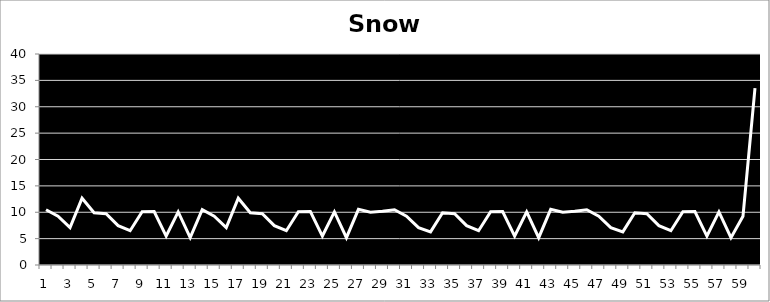
| Category | Snow |
|---|---|
| 0 | 10.479 |
| 1 | 9.241 |
| 2 | 7.08 |
| 3 | 12.66 |
| 4 | 9.905 |
| 5 | 9.719 |
| 6 | 7.466 |
| 7 | 6.505 |
| 8 | 10.093 |
| 9 | 10.122 |
| 10 | 5.49 |
| 11 | 10.057 |
| 12 | 5.175 |
| 13 | 10.479 |
| 14 | 9.241 |
| 15 | 7.08 |
| 16 | 12.66 |
| 17 | 9.905 |
| 18 | 9.719 |
| 19 | 7.466 |
| 20 | 6.505 |
| 21 | 10.093 |
| 22 | 10.122 |
| 23 | 5.49 |
| 24 | 10.057 |
| 25 | 5.175 |
| 26 | 10.555 |
| 27 | 10.001 |
| 28 | 10.201 |
| 29 | 10.479 |
| 30 | 9.241 |
| 31 | 7.08 |
| 32 | 6.278 |
| 33 | 9.905 |
| 34 | 9.719 |
| 35 | 7.466 |
| 36 | 6.505 |
| 37 | 10.093 |
| 38 | 10.122 |
| 39 | 5.49 |
| 40 | 10.057 |
| 41 | 5.175 |
| 42 | 10.555 |
| 43 | 10.001 |
| 44 | 10.201 |
| 45 | 10.479 |
| 46 | 9.241 |
| 47 | 7.08 |
| 48 | 6.278 |
| 49 | 9.905 |
| 50 | 9.719 |
| 51 | 7.466 |
| 52 | 6.505 |
| 53 | 10.093 |
| 54 | 10.122 |
| 55 | 5.49 |
| 56 | 10.057 |
| 57 | 5.175 |
| 58 | 9.241 |
| 59 | 33.518 |